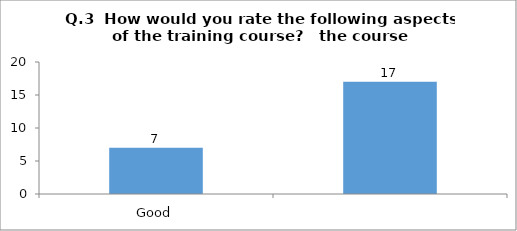
| Category | Q.3  How would you rate the following aspects of the training course?   the course vanue/training centre |
|---|---|
| Good | 7 |
|  | 17 |